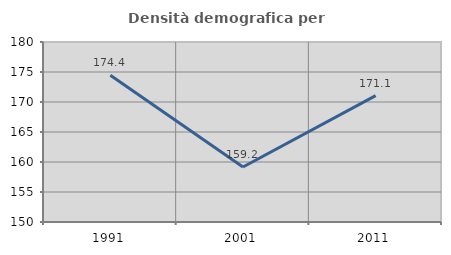
| Category | Densità demografica |
|---|---|
| 1991.0 | 174.448 |
| 2001.0 | 159.158 |
| 2011.0 | 171.061 |